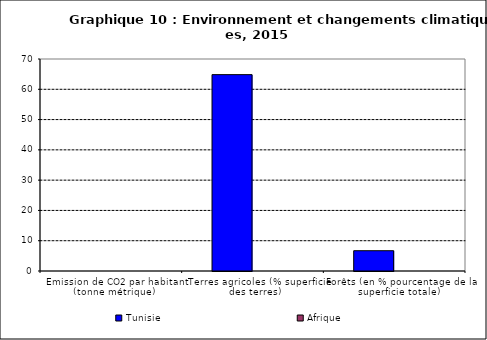
| Category | Tunisie | Afrique |
|---|---|---|
| Emission de CO2 par habitant (tonne métrique) | 0 | 0 |
| Terres agricoles (% superficie des terres) | 64.837 | 0 |
| Forêts (en % pourcentage de la superficie totale) | 6.701 | 0 |